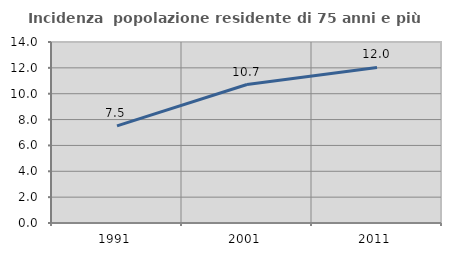
| Category | Incidenza  popolazione residente di 75 anni e più |
|---|---|
| 1991.0 | 7.514 |
| 2001.0 | 10.709 |
| 2011.0 | 12.029 |